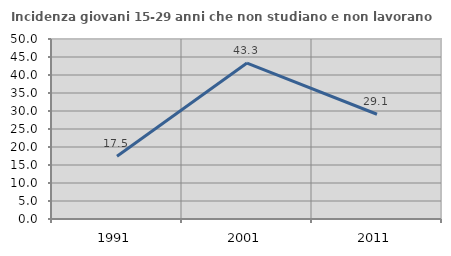
| Category | Incidenza giovani 15-29 anni che non studiano e non lavorano  |
|---|---|
| 1991.0 | 17.453 |
| 2001.0 | 43.32 |
| 2011.0 | 29.098 |